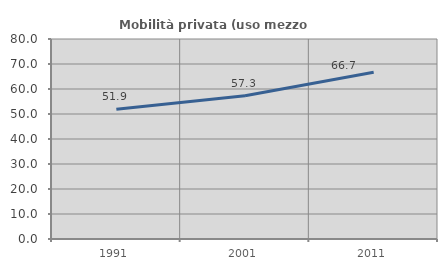
| Category | Mobilità privata (uso mezzo privato) |
|---|---|
| 1991.0 | 51.86 |
| 2001.0 | 57.263 |
| 2011.0 | 66.721 |